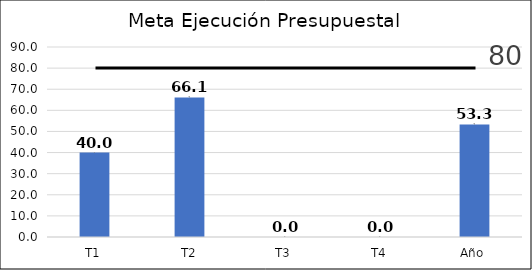
| Category | Series 0 |
|---|---|
| T1 | 39.972 |
| T2 | 66.114 |
| T3 | 0 |
| T4 | 0 |
| Año | 53.326 |